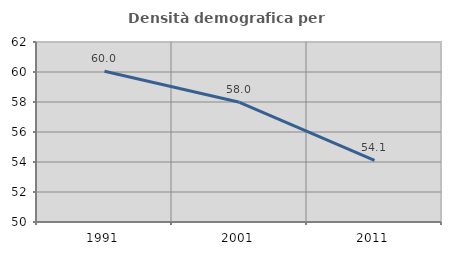
| Category | Densità demografica |
|---|---|
| 1991.0 | 60.045 |
| 2001.0 | 57.98 |
| 2011.0 | 54.1 |